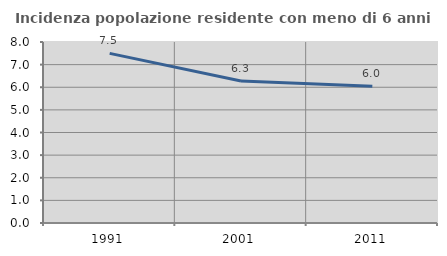
| Category | Incidenza popolazione residente con meno di 6 anni |
|---|---|
| 1991.0 | 7.498 |
| 2001.0 | 6.279 |
| 2011.0 | 6.045 |